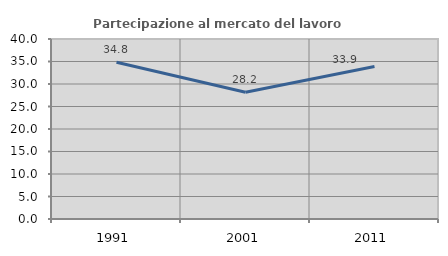
| Category | Partecipazione al mercato del lavoro  femminile |
|---|---|
| 1991.0 | 34.846 |
| 2001.0 | 28.175 |
| 2011.0 | 33.904 |